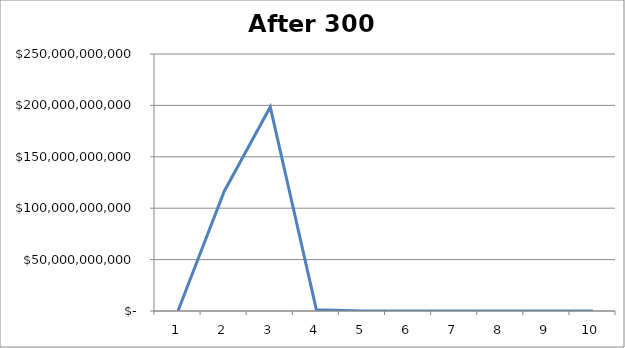
| Category | Series 0 |
|---|---|
| 0 | 249537499.098 |
| 1 | 116319248738.057 |
| 2 | 198435503053.344 |
| 3 | 1263283589.185 |
| 4 | 16000 |
| 5 | 0 |
| 6 | 0 |
| 7 | 0 |
| 8 | 0 |
| 9 | 0 |